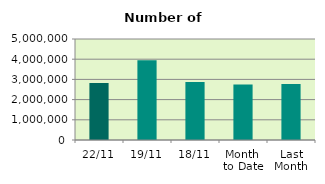
| Category | Series 0 |
|---|---|
| 22/11 | 2817940 |
| 19/11 | 3948486 |
| 18/11 | 2865982 |
| Month 
to Date | 2753682.625 |
| Last
Month | 2771381.143 |